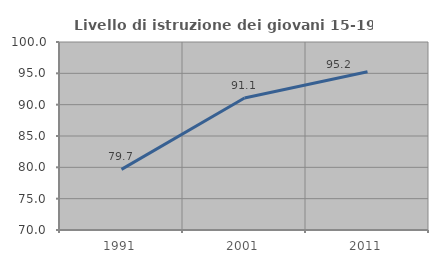
| Category | Livello di istruzione dei giovani 15-19 anni |
|---|---|
| 1991.0 | 79.67 |
| 2001.0 | 91.057 |
| 2011.0 | 95.238 |